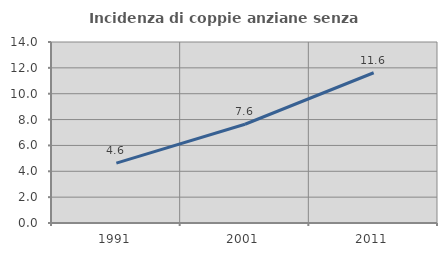
| Category | Incidenza di coppie anziane senza figli  |
|---|---|
| 1991.0 | 4.631 |
| 2001.0 | 7.639 |
| 2011.0 | 11.622 |